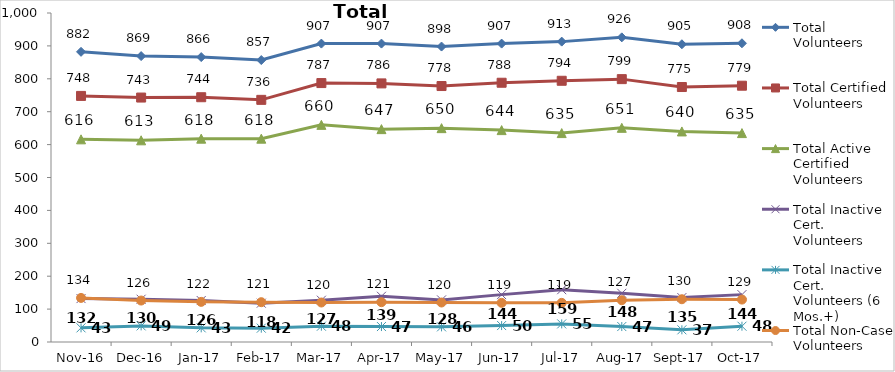
| Category | Total Volunteers | Total Certified Volunteers | Total Active Certified Volunteers | Total Inactive Cert. Volunteers | Total Inactive Cert. Volunteers (6 Mos.+) | Total Non-Case Volunteers |
|---|---|---|---|---|---|---|
| 2016-11-01 | 882 | 748 | 616 | 132 | 43 | 134 |
| 2016-12-01 | 869 | 743 | 613 | 130 | 49 | 126 |
| 2017-01-01 | 866 | 744 | 618 | 126 | 43 | 122 |
| 2017-02-01 | 857 | 736 | 618 | 118 | 42 | 121 |
| 2017-03-01 | 907 | 787 | 660 | 127 | 48 | 120 |
| 2017-04-01 | 907 | 786 | 647 | 139 | 47 | 121 |
| 2017-05-01 | 898 | 778 | 650 | 128 | 46 | 120 |
| 2017-06-01 | 907 | 788 | 644 | 144 | 50 | 119 |
| 2017-07-01 | 913 | 794 | 635 | 159 | 55 | 119 |
| 2017-08-01 | 926 | 799 | 651 | 148 | 47 | 127 |
| 2017-09-01 | 905 | 775 | 640 | 135 | 37 | 130 |
| 2017-10-01 | 908 | 779 | 635 | 144 | 48 | 129 |